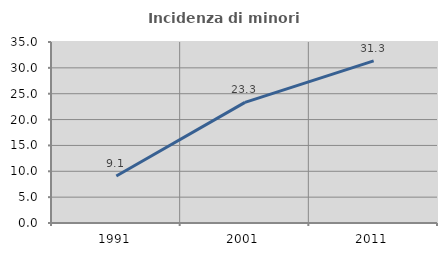
| Category | Incidenza di minori stranieri |
|---|---|
| 1991.0 | 9.091 |
| 2001.0 | 23.333 |
| 2011.0 | 31.343 |